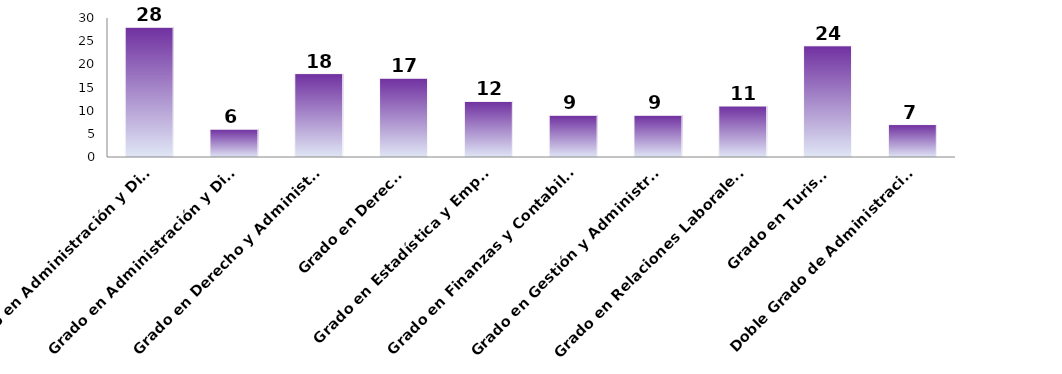
| Category | Series 0 |
|---|---|
| Grado en Administración y Dirección de Empresas | 28 |
| Grado en Administración y Dirección de Empresas (INGLÉS) | 6 |
| Grado en Derecho y Administración y Dirección de Empresas | 18 |
| Grado en Derecho | 17 |
| Grado en Estadística y Empresa | 12 |
| Grado en Finanzas y Contabilidad | 9 |
| Grado en Gestión y Administración Pública | 9 |
| Grado en Relaciones Laborales y Recursos Humanos | 11 |
| Grado en Turismo | 24 |
| Doble Grado de Administración y Dirección de Empresas y Finanzas y Contabilidad | 7 |